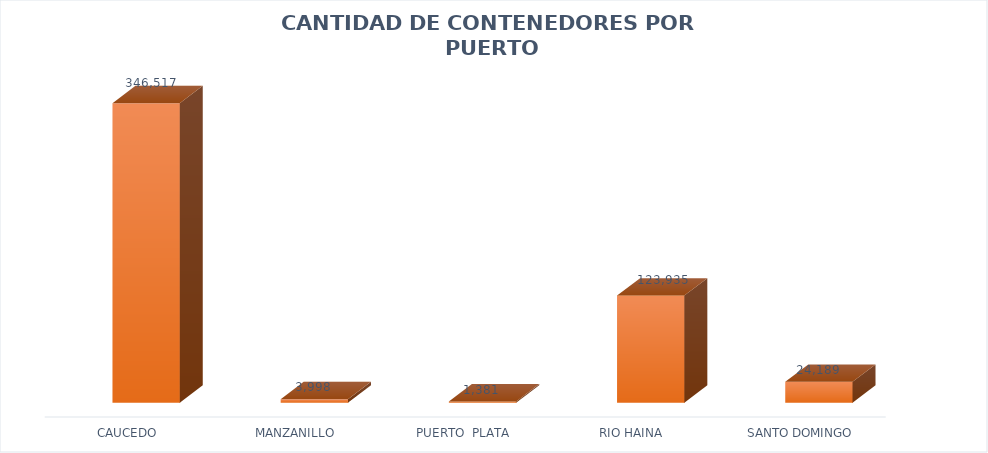
| Category | Series 1 |
|---|---|
| CAUCEDO | 346517 |
| MANZANILLO | 3998 |
| PUERTO  PLATA | 1381 |
| RIO HAINA | 123935 |
| SANTO DOMINGO | 24189 |